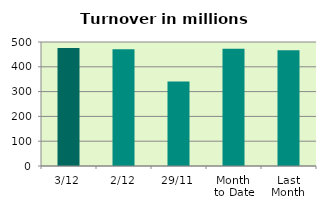
| Category | Series 0 |
|---|---|
| 3/12 | 475.558 |
| 2/12 | 470.978 |
| 29/11 | 341.023 |
| Month 
to Date | 473.268 |
| Last
Month | 466.544 |